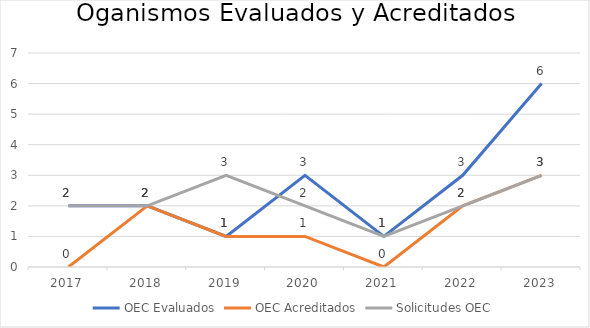
| Category | OEC Evaluados | OEC Acreditados | Solicitudes OEC |
|---|---|---|---|
| 2017.0 | 2 | 0 | 2 |
| 2018.0 | 2 | 2 | 2 |
| 2019.0 | 1 | 1 | 3 |
| 2020.0 | 3 | 1 | 2 |
| 2021.0 | 1 | 0 | 1 |
| 2022.0 | 3 | 2 | 2 |
| 2023.0 | 6 | 3 | 3 |